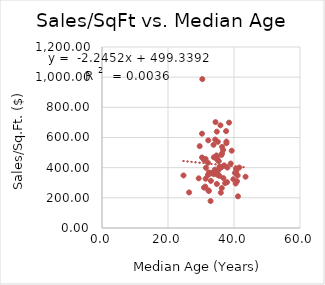
| Category | LoyaltyCard% |
|---|---|
| 2.07 | -8.31 |
| 2.54 | -4.01 |
| 1.66 | -3.94 |
| 2.06 | -3.39 |
| 2.48 | -3.3 |
| 2.96 | -1.94 |
| 2.28 | -0.77 |
| 2.34 | -0.37 |
| 2.2 | -0.25 |
| 2.34 | -0.17 |
| 2.09 | 0.47 |
| 2.47 | 0.55 |
| 2.04 | 0.77 |
| 2.02 | 1.92 |
| 2.01 | 2.05 |
| 2.64 | 2.12 |
| 2.22 | 2.84 |
| 2.07 | 2.88 |
| 1.94 | 3.96 |
| 2.17 | 4.04 |
| 0.72 | 4.05 |
| 2.0 | 4.05 |
| 1.81 | 4.24 |
| 2.13 | 4.58 |
| 2.5 | 5.09 |
| 2.63 | 5.14 |
| 1.95 | 5.48 |
| 2.04 | 5.86 |
| 1.41 | 5.91 |
| 2.05 | 5.98 |
| 2.13 | 6.08 |
| 2.08 | 6.08 |
| 2.73 | 6.13 |
| 1.95 | 6.27 |
| 2.04 | 6.57 |
| 1.62 | 6.9 |
| 1.95 | 6.94 |
| 1.64 | 7.12 |
| 1.78 | 7.39 |
| 2.23 | 7.67 |
| 2.15 | 7.91 |
| 2.83 | 8.08 |
| 2.37 | 8.27 |
| 3.07 | 8.54 |
| 2.19 | 8.58 |
| 1.28 | 8.72 |
| 1.76 | 8.75 |
| 2.51 | 8.79 |
| 1.9 | 8.9 |
| 1.98 | 9.12 |
| 2.41 | 9.47 |
| 2.17 | 10.17 |
| 2.16 | 10.66 |
| 0.29 | 10.97 |
| 1.85 | 11.34 |
| 1.88 | 11.45 |
| 2.19 | 11.51 |
| 2.56 | 11.73 |
| 2.16 | 11.83 |
| 2.1 | 11.95 |
| 1.98 | 12.47 |
| 0.87 | 12.8 |
| 1.07 | 13.78 |
| 3.38 | 14.09 |
| 1.17 | 14.23 |
| 2.14 | 14.6 |
| 0.93 | 14.88 |
| 2.22 | 15.42 |
| 1.68 | 16.18 |
| 2.41 | 17.23 |
| 2.81 | 18.43 |
| 1.09 | 20.76 |
| 0.64 | 25.54 |
| 1.77 | 28.81 |